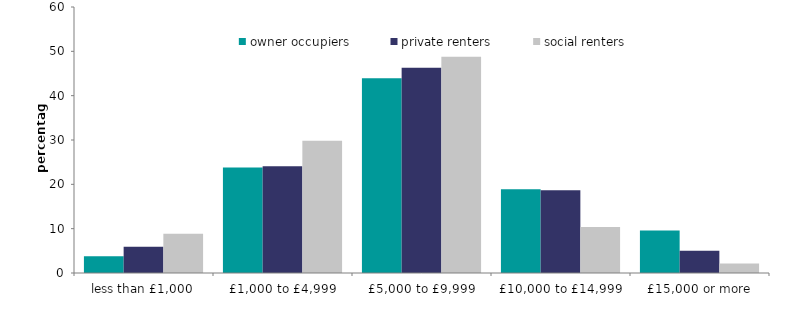
| Category | owner occupiers | private renters | social renters |
|---|---|---|---|
| less than £1,000 | 3.777 | 5.895 | 8.858 |
| £1,000 to £4,999 | 23.817 | 24.099 | 29.827 |
| £5,000 to £9,999 | 43.903 | 46.323 | 48.785 |
| £10,000 to £14,999 | 18.897 | 18.67 | 10.373 |
| £15,000 or more | 9.606 | 5.013 | 2.158 |